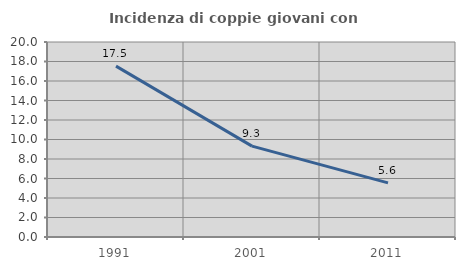
| Category | Incidenza di coppie giovani con figli |
|---|---|
| 1991.0 | 17.521 |
| 2001.0 | 9.322 |
| 2011.0 | 5.556 |